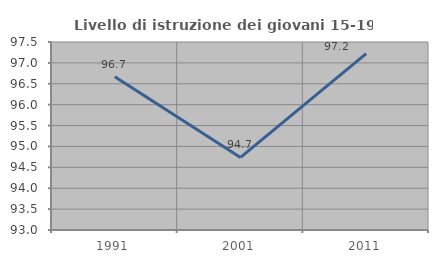
| Category | Livello di istruzione dei giovani 15-19 anni |
|---|---|
| 1991.0 | 96.667 |
| 2001.0 | 94.737 |
| 2011.0 | 97.222 |